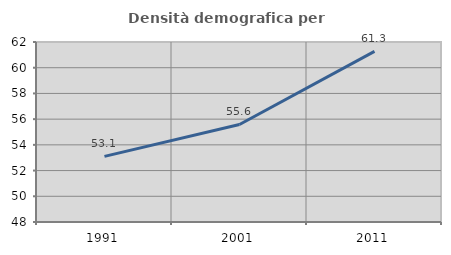
| Category | Densità demografica |
|---|---|
| 1991.0 | 53.106 |
| 2001.0 | 55.586 |
| 2011.0 | 61.271 |